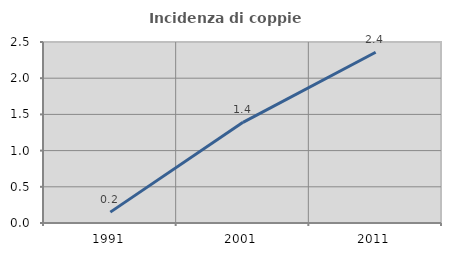
| Category | Incidenza di coppie miste |
|---|---|
| 1991.0 | 0.15 |
| 2001.0 | 1.391 |
| 2011.0 | 2.358 |